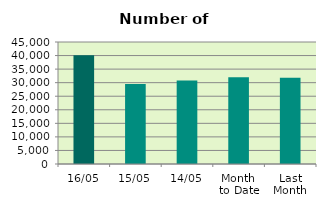
| Category | Series 0 |
|---|---|
| 16/05 | 40108 |
| 15/05 | 29470 |
| 14/05 | 30816 |
| Month 
to Date | 32030.909 |
| Last
Month | 31788.9 |